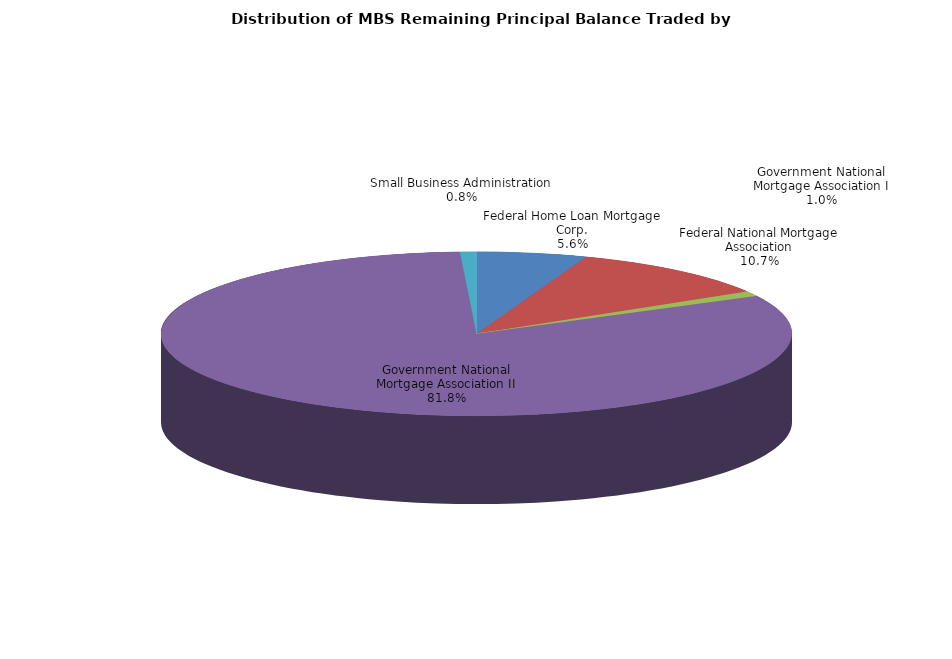
| Category | Series 0 |
|---|---|
| Federal Home Loan Mortgage Corp. | 290373249.546 |
| Federal National Mortgage Association | 553845675.155 |
| Government National Mortgage Association I | 50343474.69 |
| Government National Mortgage Association II | 4220492118.298 |
| Small Business Administration | 43233470.281 |